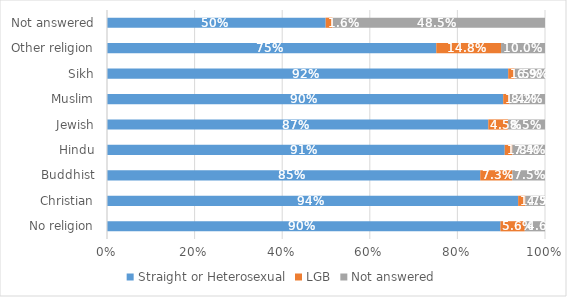
| Category | Straight or Heterosexual | LGB | Not answered |
|---|---|---|---|
| No religion | 0.898 | 0.056 | 0.046 |
| Christian | 0.939 | 0.017 | 0.045 |
| Buddhist | 0.852 | 0.073 | 0.075 |
| Hindu | 0.908 | 0.018 | 0.074 |
| Jewish | 0.871 | 0.045 | 0.085 |
| Muslim | 0.905 | 0.014 | 0.082 |
| Sikh | 0.916 | 0.015 | 0.069 |
| Other religion | 0.752 | 0.148 | 0.1 |
| Not answered | 0.499 | 0.016 | 0.485 |